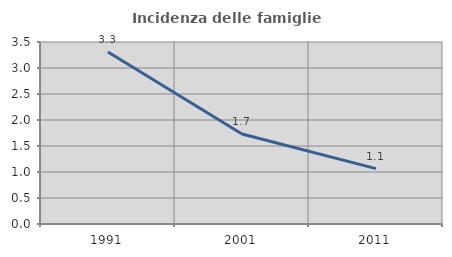
| Category | Incidenza delle famiglie numerose |
|---|---|
| 1991.0 | 3.309 |
| 2001.0 | 1.731 |
| 2011.0 | 1.066 |